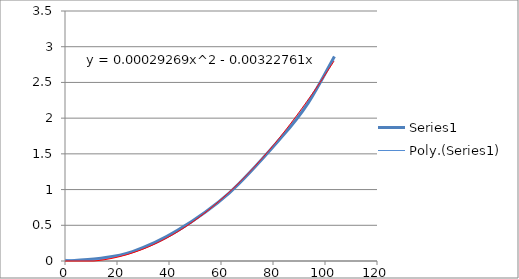
| Category | Series 0 |
|---|---|
| 0.0 | 0 |
| 13.01 | 0.035 |
| 25.95 | 0.131 |
| 43.112 | 0.425 |
| 63.234 | 0.955 |
| 83.402 | 1.738 |
| 93.497 | 2.211 |
| 103.634 | 2.864 |